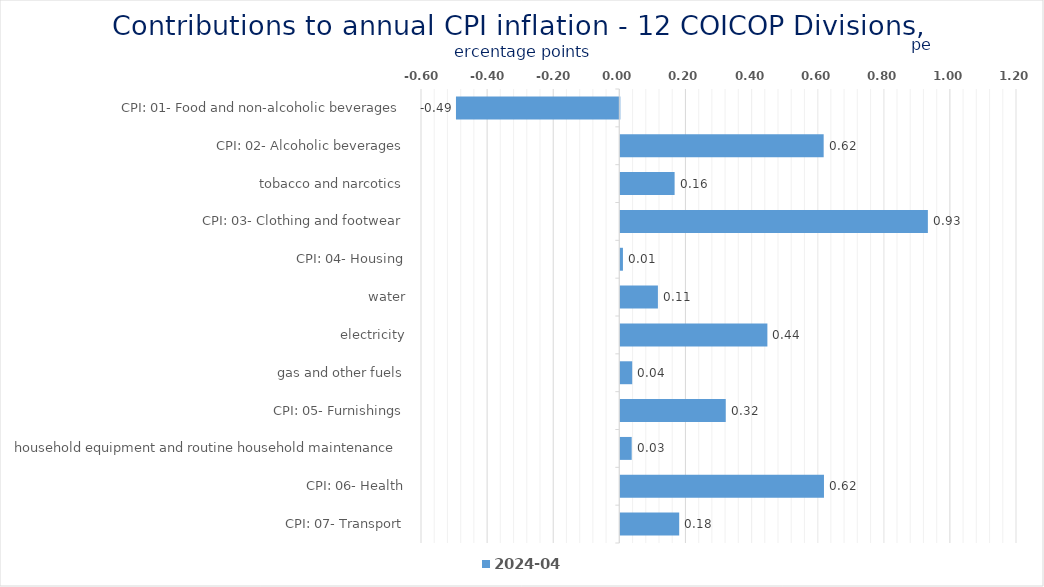
| Category | 2024-04 |
|---|---|
| CPI: 01- Food and non-alcoholic beverages | -0.494 |
| CPI: 02- Alcoholic beverages, tobacco and narcotics | 0.615 |
| CPI: 03- Clothing and footwear | 0.164 |
| CPI: 04- Housing, water, electricity, gas and other fuels | 0.93 |
| CPI: 05- Furnishings, household equipment and routine household maintenance | 0.008 |
| CPI: 06- Health | 0.114 |
| CPI: 07- Transport | 0.445 |
| CPI: 08- Communication | 0.036 |
| CPI: 09- Recreation and culture | 0.319 |
| CPI: 10- Education | 0.034 |
| CPI: 11- Restaurants and hotels | 0.616 |
| CPI: 12- Miscellaneous goods and services | 0.178 |